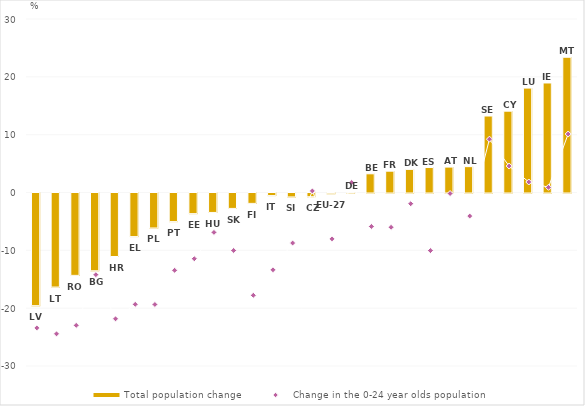
| Category | Total population change |
|---|---|
| LV | -19.477 |
| LT | -16.263 |
| RO | -14.241 |
| BG | -13.447 |
| HR | -10.982 |
| EL | -7.536 |
| PL | -6.05 |
| PT | -4.946 |
| EE | -3.568 |
| HU | -3.361 |
| SK | -2.665 |
| FI | -1.794 |
| IT | -0.447 |
| SI | -0.679 |
| CZ | -0.641 |
| EU-27 | -0.126 |
| DE | 0.014 |
| BE | 3.232 |
| FR | 3.687 |
| DK | 3.997 |
| ES | 4.319 |
| AT | 4.396 |
| NL | 4.471 |
| SE | 13.225 |
| CY | 14.06 |
| LU | 18.053 |
| IE | 18.937 |
| MT | 23.388 |